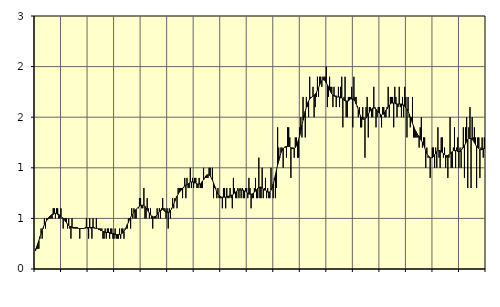
| Category | Anställda utomlands | Series 3 |
|---|---|---|
| nan | 0.2 | 0.18 |
| 87.0 | 0.2 | 0.22 |
| 87.0 | 0.2 | 0.25 |
| 87.0 | 0.2 | 0.28 |
| 87.0 | 0.3 | 0.32 |
| 87.0 | 0.4 | 0.35 |
| 87.0 | 0.3 | 0.38 |
| 87.0 | 0.4 | 0.41 |
| 87.0 | 0.5 | 0.44 |
| 87.0 | 0.4 | 0.46 |
| 87.0 | 0.5 | 0.48 |
| 87.0 | 0.5 | 0.49 |
| nan | 0.5 | 0.51 |
| 88.0 | 0.5 | 0.52 |
| 88.0 | 0.5 | 0.53 |
| 88.0 | 0.5 | 0.54 |
| 88.0 | 0.6 | 0.54 |
| 88.0 | 0.6 | 0.55 |
| 88.0 | 0.5 | 0.55 |
| 88.0 | 0.6 | 0.55 |
| 88.0 | 0.6 | 0.54 |
| 88.0 | 0.5 | 0.54 |
| 88.0 | 0.5 | 0.53 |
| 88.0 | 0.6 | 0.52 |
| nan | 0.5 | 0.51 |
| 89.0 | 0.4 | 0.5 |
| 89.0 | 0.5 | 0.49 |
| 89.0 | 0.5 | 0.47 |
| 89.0 | 0.5 | 0.46 |
| 89.0 | 0.4 | 0.44 |
| 89.0 | 0.5 | 0.43 |
| 89.0 | 0.4 | 0.42 |
| 89.0 | 0.3 | 0.42 |
| 89.0 | 0.5 | 0.41 |
| 89.0 | 0.4 | 0.41 |
| 89.0 | 0.4 | 0.41 |
| nan | 0.4 | 0.41 |
| 90.0 | 0.4 | 0.41 |
| 90.0 | 0.4 | 0.41 |
| 90.0 | 0.4 | 0.4 |
| 90.0 | 0.3 | 0.4 |
| 90.0 | 0.4 | 0.4 |
| 90.0 | 0.4 | 0.4 |
| 90.0 | 0.4 | 0.4 |
| 90.0 | 0.4 | 0.4 |
| 90.0 | 0.4 | 0.41 |
| 90.0 | 0.5 | 0.41 |
| 90.0 | 0.4 | 0.41 |
| nan | 0.3 | 0.41 |
| 91.0 | 0.5 | 0.41 |
| 91.0 | 0.4 | 0.41 |
| 91.0 | 0.3 | 0.41 |
| 91.0 | 0.5 | 0.41 |
| 91.0 | 0.4 | 0.41 |
| 91.0 | 0.4 | 0.4 |
| 91.0 | 0.5 | 0.4 |
| 91.0 | 0.4 | 0.4 |
| 91.0 | 0.4 | 0.39 |
| 91.0 | 0.4 | 0.39 |
| 91.0 | 0.4 | 0.38 |
| nan | 0.4 | 0.38 |
| 92.0 | 0.3 | 0.37 |
| 92.0 | 0.3 | 0.37 |
| 92.0 | 0.4 | 0.36 |
| 92.0 | 0.3 | 0.36 |
| 92.0 | 0.4 | 0.36 |
| 92.0 | 0.4 | 0.36 |
| 92.0 | 0.3 | 0.36 |
| 92.0 | 0.4 | 0.35 |
| 92.0 | 0.4 | 0.35 |
| 92.0 | 0.3 | 0.35 |
| 92.0 | 0.3 | 0.35 |
| nan | 0.4 | 0.34 |
| 93.0 | 0.3 | 0.34 |
| 93.0 | 0.3 | 0.34 |
| 93.0 | 0.3 | 0.34 |
| 93.0 | 0.4 | 0.34 |
| 93.0 | 0.3 | 0.34 |
| 93.0 | 0.4 | 0.35 |
| 93.0 | 0.4 | 0.36 |
| 93.0 | 0.3 | 0.37 |
| 93.0 | 0.4 | 0.39 |
| 93.0 | 0.4 | 0.41 |
| 93.0 | 0.4 | 0.44 |
| nan | 0.5 | 0.46 |
| 94.0 | 0.5 | 0.49 |
| 94.0 | 0.4 | 0.51 |
| 94.0 | 0.6 | 0.53 |
| 94.0 | 0.5 | 0.54 |
| 94.0 | 0.6 | 0.56 |
| 94.0 | 0.5 | 0.58 |
| 94.0 | 0.5 | 0.59 |
| 94.0 | 0.6 | 0.6 |
| 94.0 | 0.6 | 0.61 |
| 94.0 | 0.7 | 0.62 |
| 94.0 | 0.7 | 0.63 |
| nan | 0.6 | 0.63 |
| 95.0 | 0.6 | 0.63 |
| 95.0 | 0.8 | 0.63 |
| 95.0 | 0.5 | 0.62 |
| 95.0 | 0.5 | 0.6 |
| 95.0 | 0.7 | 0.59 |
| 95.0 | 0.6 | 0.57 |
| 95.0 | 0.5 | 0.55 |
| 95.0 | 0.6 | 0.54 |
| 95.0 | 0.5 | 0.52 |
| 95.0 | 0.4 | 0.52 |
| 95.0 | 0.5 | 0.51 |
| nan | 0.5 | 0.52 |
| 96.0 | 0.5 | 0.52 |
| 96.0 | 0.6 | 0.54 |
| 96.0 | 0.5 | 0.55 |
| 96.0 | 0.6 | 0.57 |
| 96.0 | 0.5 | 0.58 |
| 96.0 | 0.6 | 0.58 |
| 96.0 | 0.7 | 0.59 |
| 96.0 | 0.6 | 0.58 |
| 96.0 | 0.6 | 0.57 |
| 96.0 | 0.5 | 0.57 |
| 96.0 | 0.6 | 0.56 |
| nan | 0.4 | 0.56 |
| 97.0 | 0.6 | 0.56 |
| 97.0 | 0.5 | 0.58 |
| 97.0 | 0.6 | 0.59 |
| 97.0 | 0.7 | 0.62 |
| 97.0 | 0.6 | 0.64 |
| 97.0 | 0.7 | 0.67 |
| 97.0 | 0.7 | 0.7 |
| 97.0 | 0.6 | 0.72 |
| 97.0 | 0.8 | 0.74 |
| 97.0 | 0.8 | 0.76 |
| 97.0 | 0.8 | 0.77 |
| nan | 0.8 | 0.78 |
| 98.0 | 0.7 | 0.8 |
| 98.0 | 0.8 | 0.81 |
| 98.0 | 0.9 | 0.82 |
| 98.0 | 0.7 | 0.83 |
| 98.0 | 0.9 | 0.83 |
| 98.0 | 0.8 | 0.84 |
| 98.0 | 0.8 | 0.85 |
| 98.0 | 1 | 0.86 |
| 98.0 | 0.8 | 0.86 |
| 98.0 | 0.9 | 0.86 |
| 98.0 | 0.8 | 0.86 |
| nan | 0.9 | 0.85 |
| 99.0 | 0.9 | 0.85 |
| 99.0 | 0.8 | 0.84 |
| 99.0 | 0.8 | 0.84 |
| 99.0 | 0.9 | 0.84 |
| 99.0 | 0.8 | 0.84 |
| 99.0 | 0.8 | 0.85 |
| 99.0 | 0.8 | 0.87 |
| 99.0 | 1 | 0.88 |
| 99.0 | 0.9 | 0.9 |
| 99.0 | 0.9 | 0.92 |
| 99.0 | 0.9 | 0.93 |
| nan | 0.9 | 0.93 |
| 0.0 | 1 | 0.93 |
| 0.0 | 1 | 0.92 |
| 0.0 | 0.9 | 0.9 |
| 0.0 | 1 | 0.88 |
| 0.0 | 0.7 | 0.85 |
| 0.0 | 0.8 | 0.82 |
| 0.0 | 0.8 | 0.79 |
| 0.0 | 0.7 | 0.76 |
| 0.0 | 0.8 | 0.74 |
| 0.0 | 0.7 | 0.73 |
| 0.0 | 0.7 | 0.72 |
| nan | 0.7 | 0.71 |
| 1.0 | 0.6 | 0.71 |
| 1.0 | 0.8 | 0.71 |
| 1.0 | 0.8 | 0.71 |
| 1.0 | 0.6 | 0.71 |
| 1.0 | 0.8 | 0.71 |
| 1.0 | 0.7 | 0.72 |
| 1.0 | 0.7 | 0.72 |
| 1.0 | 0.8 | 0.72 |
| 1.0 | 0.7 | 0.73 |
| 1.0 | 0.6 | 0.73 |
| 1.0 | 0.9 | 0.74 |
| nan | 0.8 | 0.75 |
| 2.0 | 0.7 | 0.76 |
| 2.0 | 0.7 | 0.77 |
| 2.0 | 0.8 | 0.78 |
| 2.0 | 0.7 | 0.78 |
| 2.0 | 0.8 | 0.78 |
| 2.0 | 0.7 | 0.78 |
| 2.0 | 0.8 | 0.78 |
| 2.0 | 0.7 | 0.78 |
| 2.0 | 0.7 | 0.77 |
| 2.0 | 0.8 | 0.77 |
| 2.0 | 0.8 | 0.76 |
| nan | 0.7 | 0.75 |
| 3.0 | 0.9 | 0.74 |
| 3.0 | 0.8 | 0.74 |
| 3.0 | 0.6 | 0.74 |
| 3.0 | 0.7 | 0.74 |
| 3.0 | 0.7 | 0.75 |
| 3.0 | 0.8 | 0.76 |
| 3.0 | 0.9 | 0.77 |
| 3.0 | 0.7 | 0.78 |
| 3.0 | 0.7 | 0.8 |
| 3.0 | 1.1 | 0.8 |
| 3.0 | 0.7 | 0.81 |
| nan | 0.7 | 0.81 |
| 4.0 | 1 | 0.8 |
| 4.0 | 0.7 | 0.79 |
| 4.0 | 0.8 | 0.78 |
| 4.0 | 0.9 | 0.78 |
| 4.0 | 0.7 | 0.77 |
| 4.0 | 0.8 | 0.76 |
| 4.0 | 0.7 | 0.76 |
| 4.0 | 0.7 | 0.76 |
| 4.0 | 1 | 0.78 |
| 4.0 | 0.8 | 0.8 |
| 4.0 | 0.7 | 0.84 |
| nan | 0.9 | 0.88 |
| 5.0 | 0.7 | 0.93 |
| 5.0 | 0.8 | 0.98 |
| 5.0 | 1.4 | 1.03 |
| 5.0 | 1.2 | 1.07 |
| 5.0 | 1.1 | 1.11 |
| 5.0 | 1.2 | 1.15 |
| 5.0 | 1.2 | 1.17 |
| 5.0 | 1 | 1.19 |
| 5.0 | 1.2 | 1.2 |
| 5.0 | 1.2 | 1.21 |
| 5.0 | 1.1 | 1.21 |
| nan | 1.4 | 1.21 |
| 6.0 | 1.4 | 1.21 |
| 6.0 | 1.3 | 1.21 |
| 6.0 | 0.9 | 1.2 |
| 6.0 | 1.2 | 1.19 |
| 6.0 | 1.2 | 1.19 |
| 6.0 | 1.1 | 1.19 |
| 6.0 | 1.3 | 1.2 |
| 6.0 | 1.3 | 1.22 |
| 6.0 | 1.1 | 1.25 |
| 6.0 | 1.1 | 1.28 |
| 6.0 | 1.4 | 1.32 |
| nan | 1.5 | 1.37 |
| 7.0 | 1.3 | 1.42 |
| 7.0 | 1.7 | 1.47 |
| 7.0 | 1.5 | 1.52 |
| 7.0 | 1.3 | 1.56 |
| 7.0 | 1.7 | 1.6 |
| 7.0 | 1.6 | 1.64 |
| 7.0 | 1.5 | 1.66 |
| 7.0 | 1.9 | 1.68 |
| 7.0 | 1.7 | 1.69 |
| 7.0 | 1.7 | 1.7 |
| 7.0 | 1.8 | 1.71 |
| nan | 1.5 | 1.71 |
| 8.0 | 1.6 | 1.73 |
| 8.0 | 1.7 | 1.74 |
| 8.0 | 1.9 | 1.77 |
| 8.0 | 1.7 | 1.79 |
| 8.0 | 1.9 | 1.82 |
| 8.0 | 1.9 | 1.85 |
| 8.0 | 1.8 | 1.86 |
| 8.0 | 1.9 | 1.87 |
| 8.0 | 1.9 | 1.87 |
| 8.0 | 1.9 | 1.86 |
| 8.0 | 2 | 1.84 |
| nan | 1.6 | 1.82 |
| 9.0 | 1.7 | 1.8 |
| 9.0 | 1.9 | 1.77 |
| 9.0 | 1.8 | 1.75 |
| 9.0 | 1.8 | 1.73 |
| 9.0 | 1.6 | 1.72 |
| 9.0 | 1.8 | 1.71 |
| 9.0 | 1.7 | 1.71 |
| 9.0 | 1.6 | 1.71 |
| 9.0 | 1.7 | 1.7 |
| 9.0 | 1.8 | 1.7 |
| 9.0 | 1.6 | 1.7 |
| nan | 1.8 | 1.69 |
| 10.0 | 1.9 | 1.69 |
| 10.0 | 1.4 | 1.68 |
| 10.0 | 1.7 | 1.67 |
| 10.0 | 1.9 | 1.66 |
| 10.0 | 1.5 | 1.66 |
| 10.0 | 1.5 | 1.66 |
| 10.0 | 1.7 | 1.66 |
| 10.0 | 1.7 | 1.67 |
| 10.0 | 1.7 | 1.68 |
| 10.0 | 1.8 | 1.68 |
| 10.0 | 1.4 | 1.68 |
| nan | 1.9 | 1.67 |
| 11.0 | 1.7 | 1.66 |
| 11.0 | 1.7 | 1.63 |
| 11.0 | 1.6 | 1.61 |
| 11.0 | 1.5 | 1.57 |
| 11.0 | 1.6 | 1.54 |
| 11.0 | 1.4 | 1.51 |
| 11.0 | 1.4 | 1.49 |
| 11.0 | 1.6 | 1.48 |
| 11.0 | 1.5 | 1.48 |
| 11.0 | 1.1 | 1.48 |
| 11.0 | 1.6 | 1.49 |
| nan | 1.7 | 1.51 |
| 12.0 | 1.3 | 1.53 |
| 12.0 | 1.6 | 1.55 |
| 12.0 | 1.6 | 1.57 |
| 12.0 | 1.5 | 1.58 |
| 12.0 | 1.5 | 1.59 |
| 12.0 | 1.8 | 1.59 |
| 12.0 | 1.6 | 1.59 |
| 12.0 | 1.4 | 1.58 |
| 12.0 | 1.5 | 1.56 |
| 12.0 | 1.6 | 1.55 |
| 12.0 | 1.6 | 1.54 |
| nan | 1.5 | 1.53 |
| 13.0 | 1.4 | 1.52 |
| 13.0 | 1.6 | 1.53 |
| 13.0 | 1.6 | 1.53 |
| 13.0 | 1.5 | 1.55 |
| 13.0 | 1.5 | 1.57 |
| 13.0 | 1.6 | 1.58 |
| 13.0 | 1.8 | 1.6 |
| 13.0 | 1.5 | 1.62 |
| 13.0 | 1.7 | 1.63 |
| 13.0 | 1.7 | 1.64 |
| 13.0 | 1.7 | 1.64 |
| nan | 1.4 | 1.64 |
| 14.0 | 1.8 | 1.64 |
| 14.0 | 1.7 | 1.63 |
| 14.0 | 1.5 | 1.63 |
| 14.0 | 1.6 | 1.63 |
| 14.0 | 1.8 | 1.63 |
| 14.0 | 1.6 | 1.63 |
| 14.0 | 1.5 | 1.63 |
| 14.0 | 1.7 | 1.62 |
| 14.0 | 1.5 | 1.62 |
| 14.0 | 1.8 | 1.61 |
| 14.0 | 1.7 | 1.59 |
| nan | 1.3 | 1.58 |
| 15.0 | 1.7 | 1.56 |
| 15.0 | 1.5 | 1.53 |
| 15.0 | 1.4 | 1.5 |
| 15.0 | 1.5 | 1.47 |
| 15.0 | 1.7 | 1.44 |
| 15.0 | 1.3 | 1.41 |
| 15.0 | 1.3 | 1.38 |
| 15.0 | 1.3 | 1.36 |
| 15.0 | 1.3 | 1.34 |
| 15.0 | 1.3 | 1.32 |
| 15.0 | 1.2 | 1.31 |
| nan | 1.4 | 1.29 |
| 16.0 | 1.5 | 1.27 |
| 16.0 | 1.2 | 1.25 |
| 16.0 | 1.3 | 1.23 |
| 16.0 | 1.3 | 1.2 |
| 16.0 | 1 | 1.17 |
| 16.0 | 1.2 | 1.14 |
| 16.0 | 1.1 | 1.12 |
| 16.0 | 1.1 | 1.11 |
| 16.0 | 0.9 | 1.1 |
| 16.0 | 1.1 | 1.1 |
| 16.0 | 1.2 | 1.1 |
| nan | 1.2 | 1.11 |
| 17.0 | 1 | 1.13 |
| 17.0 | 1.2 | 1.14 |
| 17.0 | 1 | 1.16 |
| 17.0 | 1.4 | 1.17 |
| 17.0 | 1.1 | 1.17 |
| 17.0 | 1 | 1.17 |
| 17.0 | 1.3 | 1.16 |
| 17.0 | 1.3 | 1.15 |
| 17.0 | 1.1 | 1.14 |
| 17.0 | 1.2 | 1.13 |
| 17.0 | 1 | 1.12 |
| nan | 1.1 | 1.12 |
| 18.0 | 0.9 | 1.12 |
| 18.0 | 1.1 | 1.13 |
| 18.0 | 1.5 | 1.14 |
| 18.0 | 1 | 1.15 |
| 18.0 | 1 | 1.16 |
| 18.0 | 1.2 | 1.17 |
| 18.0 | 1.4 | 1.17 |
| 18.0 | 1 | 1.17 |
| 18.0 | 1.2 | 1.17 |
| 18.0 | 1.3 | 1.16 |
| 18.0 | 1 | 1.16 |
| nan | 1.2 | 1.16 |
| 19.0 | 1 | 1.17 |
| 19.0 | 1.2 | 1.19 |
| 19.0 | 1.4 | 1.2 |
| 19.0 | 0.9 | 1.22 |
| 19.0 | 1.4 | 1.24 |
| 19.0 | 1.5 | 1.26 |
| 19.0 | 0.8 | 1.28 |
| 19.0 | 1.4 | 1.29 |
| 19.0 | 1.6 | 1.29 |
| 19.0 | 0.8 | 1.29 |
| 19.0 | 1.5 | 1.28 |
| nan | 1.3 | 1.27 |
| 20.0 | 1.4 | 1.25 |
| 20.0 | 1.3 | 1.23 |
| 20.0 | 0.8 | 1.21 |
| 20.0 | 1.3 | 1.2 |
| 20.0 | 1.3 | 1.19 |
| 20.0 | 0.9 | 1.18 |
| 20.0 | 1.2 | 1.18 |
| 20.0 | 1.3 | 1.18 |
| 20.0 | 1.1 | 1.19 |
| 20.0 | 1.3 | 1.19 |
| 20.0 | 1.2 | 1.2 |